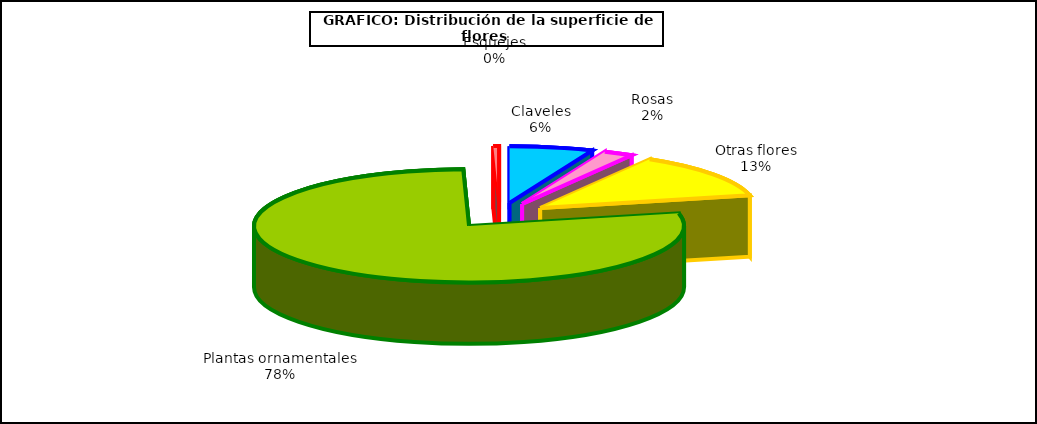
| Category | Series 0 |
|---|---|
| 0 | 39713 |
| 1 | 14086 |
| 2 | 81790 |
| 3 | 494632 |
| 4 | 2710 |